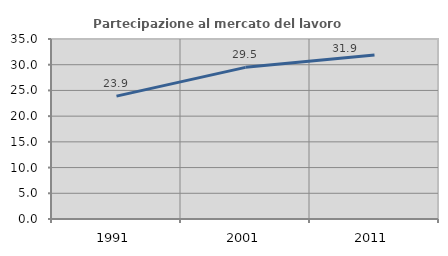
| Category | Partecipazione al mercato del lavoro  femminile |
|---|---|
| 1991.0 | 23.887 |
| 2001.0 | 29.484 |
| 2011.0 | 31.873 |